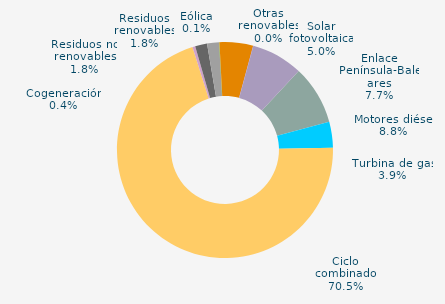
| Category | Series 0 |
|---|---|
| Carbón | 0 |
| Motores diésel | 8.843 |
| Turbina de gas | 3.879 |
| Ciclo combinado | 70.461 |
| Generación auxiliar | 0 |
| Cogeneración | 0.421 |
| Residuos no renovables | 1.789 |
| Residuos renovables | 1.789 |
| Eólica | 0.055 |
| Solar fotovoltaica | 5.015 |
| Otras renovables | 0.038 |
| Enlace Península-Baleares | 7.71 |